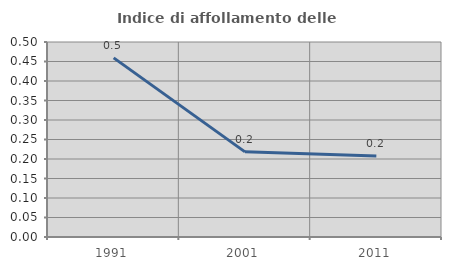
| Category | Indice di affollamento delle abitazioni  |
|---|---|
| 1991.0 | 0.459 |
| 2001.0 | 0.218 |
| 2011.0 | 0.208 |